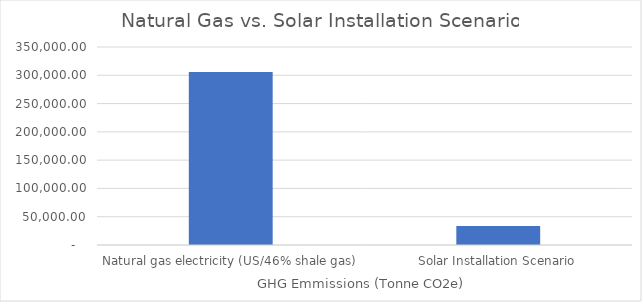
| Category | Series 0 |
|---|---|
| Natural gas electricity (US/46% shale gas) | 305791.494 |
| Solar Installation Scenario | 33385.644 |